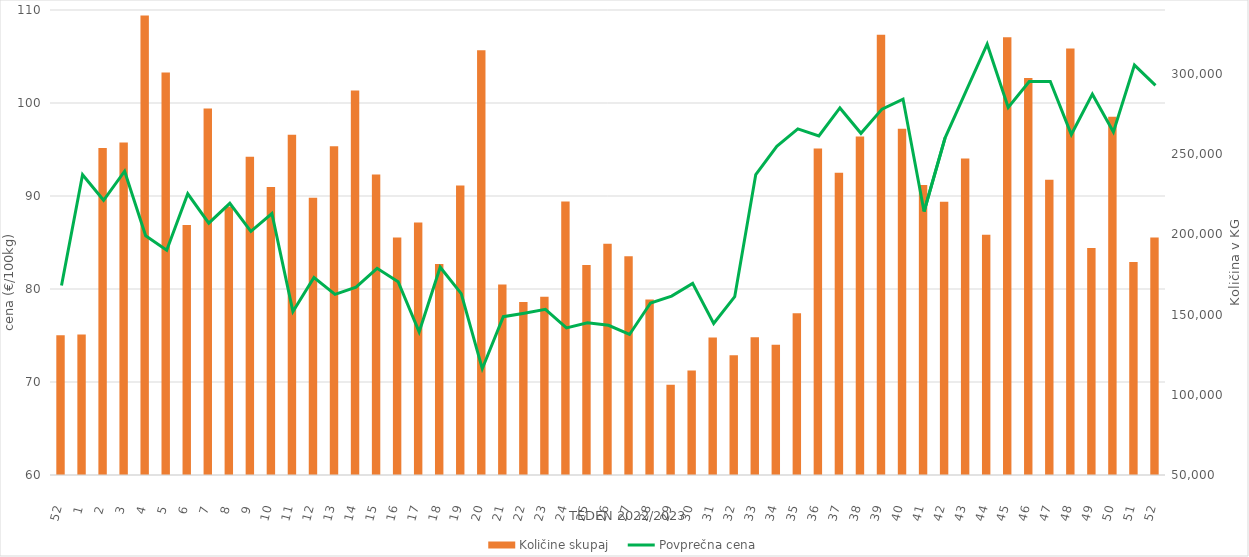
| Category | Količine skupaj |
|---|---|
| 52.0 | 137205 |
| 1.0 | 137621 |
| 2.0 | 253923 |
| 3.0 | 257437 |
| 4.0 | 336601 |
| 5.0 | 301039 |
| 6.0 | 205960 |
| 7.0 | 278619 |
| 8.0 | 217523 |
| 9.0 | 248505 |
| 10.0 | 229566 |
| 11.0 | 262133 |
| 12.0 | 222960 |
| 13.0 | 255094 |
| 14.0 | 289803 |
| 15.0 | 237452 |
| 16.0 | 198178 |
| 17.0 | 207508 |
| 18.0 | 181549 |
| 19.0 | 230549 |
| 20.0 | 314916 |
| 21.0 | 168842 |
| 22.0 | 157847 |
| 23.0 | 161168 |
| 24.0 | 220505 |
| 25.0 | 181034 |
| 26.0 | 194143 |
| 27.0 | 186498 |
| 28.0 | 159385 |
| 29.0 | 106259 |
| 30.0 | 115136 |
| 31.0 | 135749 |
| 32.0 | 124681 |
| 33.0 | 135946 |
| 34.0 | 131298 |
| 35.0 | 150829 |
| 36.0 | 253688 |
| 37.0 | 238530 |
| 38.0 | 261109 |
| 39.0 | 324533 |
| 40.0 | 265941 |
| 41.0 | 230899 |
| 42.0 | 220379 |
| 43.0 | 247352 |
| 44.0 | 199862 |
| 45.0 | 323014 |
| 46.0 | 297561 |
| 47.0 | 234160 |
| 48.0 | 315941 |
| 49.0 | 191595 |
| 50.0 | 273431 |
| 51.0 | 182819 |
| 52.0 | 198131 |